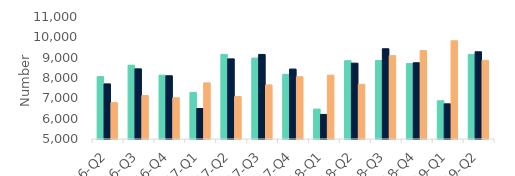
| Category | First-time
buyers | Homemovers | Homowner remortgaging |
|---|---|---|---|
| 16-Q2 | 8070 | 7710 | 6790 |
| 16-Q3 | 8630 | 8450 | 7140 |
| 16-Q4 | 8140 | 8110 | 7030 |
| 17-Q1 | 7290 | 6500 | 7760 |
| 17-Q2 | 9160 | 8940 | 7090 |
| 17-Q3 | 8980 | 9160 | 7660 |
| 17-Q4 | 8180 | 8440 | 8060 |
| 18-Q1 | 6470 | 6210 | 8140 |
| 18-Q2 | 8850 | 8730 | 7690 |
| 18-Q3 | 8860 | 9440 | 9100 |
| 18-Q4 | 8710 | 8750 | 9350 |
| 19-Q1 | 6880 | 6730 | 9830 |
| 19-Q2 | 9160 | 9290 | 8870 |